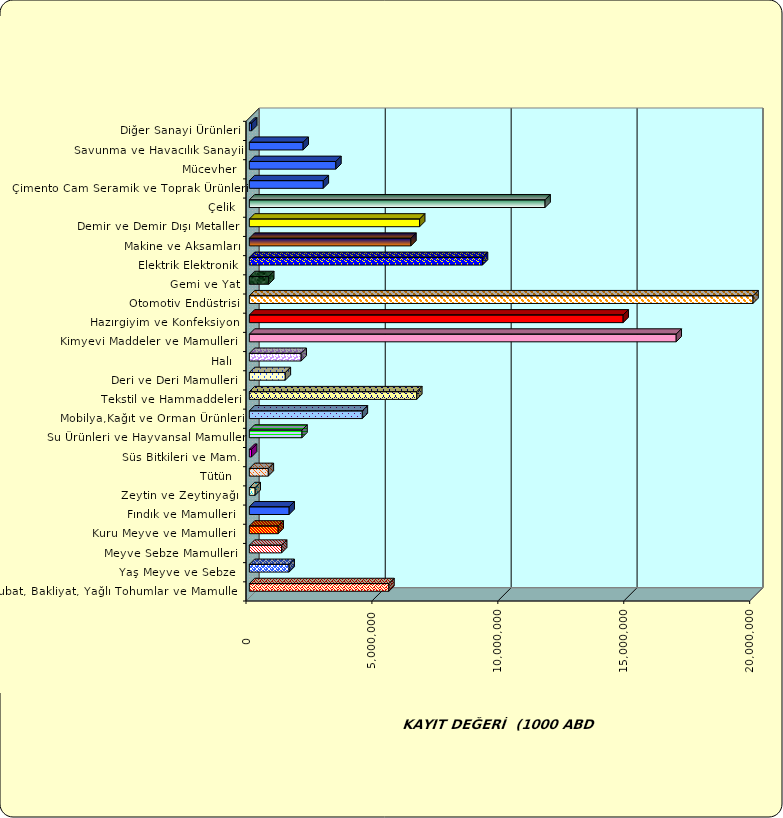
| Category | Series 0 |
|---|---|
|  Hububat, Bakliyat, Yağlı Tohumlar ve Mamulleri  | 5542435 |
|  Yaş Meyve ve Sebze   | 1579700.876 |
|  Meyve Sebze Mamulleri  | 1282688.95 |
|  Kuru Meyve ve Mamulleri   | 1144628.643 |
|  Fındık ve Mamulleri  | 1580845.455 |
|  Zeytin ve Zeytinyağı  | 230665.099 |
|  Tütün  | 752990.995 |
|  Süs Bitkileri ve Mam. | 87301.763 |
|  Su Ürünleri ve Hayvansal Mamuller | 2090045.052 |
|  Mobilya,Kağıt ve Orman Ürünleri | 4486598.063 |
|  Tekstil ve Hammaddeleri | 6648867.8 |
|  Deri ve Deri Mamulleri  | 1428221.907 |
|  Halı  | 2058194.726 |
|  Kimyevi Maddeler ve Mamulleri   | 16949747.132 |
|  Hazırgiyim ve Konfeksiyon  | 14843705.297 |
|  Otomotiv Endüstrisi | 25364305.81 |
|  Gemi ve Yat | 769017.853 |
|  Elektrik Elektronik | 9257660.157 |
|  Makine ve Aksamları | 6415665.672 |
|  Demir ve Demir Dışı Metaller  | 6762553.162 |
|  Çelik | 11742319.634 |
|  Çimento Cam Seramik ve Toprak Ürünleri | 2936576.841 |
|  Mücevher | 3436302.523 |
|  Savunma ve Havacılık Sanayii | 2135816.38 |
|  Diğer Sanayi Ürünleri | 91920.431 |